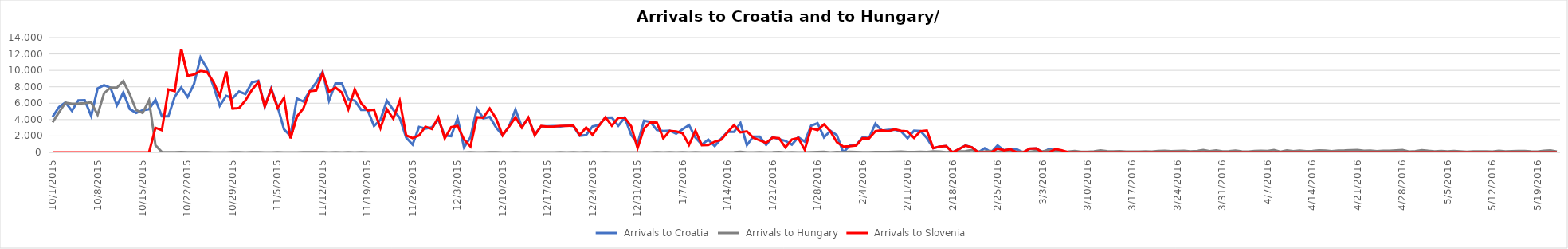
| Category | Arrivals to Croatia | Arrivals to Hungary | Arrivals to Slovenia |
|---|---|---|---|
| 10/1/15 | 4344 | 3667 | 0 |
| 10/2/15 | 5546 | 4897 | 0 |
| 10/3/15 | 6086 | 6056 | 0 |
| 10/4/15 | 5065 | 5925 | 0 |
| 10/5/15 | 6338 | 5952 | 0 |
| 10/6/15 | 6370 | 6000 | 0 |
| 10/7/15 | 4446 | 6103 | 0 |
| 10/8/15 | 7798 | 4583 | 6 |
| 10/9/15 | 8201 | 7215 | 0 |
| 10/10/15 | 7896 | 7907 | 0 |
| 10/11/15 | 5732 | 7897 | 0 |
| 10/12/15 | 7317 | 8702 | 0 |
| 10/13/15 | 5286 | 7081 | 0 |
| 10/14/15 | 4814 | 5157 | 0 |
| 10/15/15 | 5138 | 4808 | 0 |
| 10/16/15 | 5260 | 6353 | 0 |
| 10/17/15 | 6415 | 870 | 3000 |
| 10/18/15 | 4390 | 41 | 2700 |
| 10/19/15 | 4388 | 22 | 7677 |
| 10/20/15 | 6793 | 36 | 7478 |
| 10/21/15 | 7900 | 39 | 12616 |
| 10/22/15 | 6748 | 32 | 9339 |
| 10/23/15 | 8348 | 29 | 9500 |
| 10/24/15 | 11570 | 35 | 9925 |
| 10/25/15 | 10249 | 34 | 9818 |
| 10/26/15 | 8128 | 12 | 8625 |
| 10/27/15 | 5683 | 7 | 6877 |
| 10/28/15 | 6900 | 4 | 9848 |
| 10/29/15 | 6615 | 23 | 5341 |
| 10/30/15 | 7429 | 18 | 5409 |
| 10/31/15 | 7110 | 10 | 6344 |
| 11/1/15 | 8534 | 14 | 7611 |
| 11/2/15 | 8746 | 31 | 8568 |
| 11/3/15 | 5573 | 8 | 5591 |
| 11/4/15 | 7792 | 10 | 7693 |
| 11/5/15 | 5587 | 18 | 5426 |
| 11/6/15 | 2809 | 4 | 6655 |
| 11/7/15 | 2000 | 8 | 1716 |
| 11/8/15 | 6579 | 9 | 4381 |
| 11/9/15 | 6214 | 25 | 5341 |
| 11/10/15 | 7474 | 14 | 7457 |
| 11/11/15 | 8524 | 13 | 7554 |
| 11/12/15 | 9823 | 23 | 9681 |
| 11/13/15 | 6314 | 6 | 7397 |
| 11/14/15 | 8405 | 21 | 7905 |
| 11/15/15 | 8415 | 8 | 7300 |
| 11/16/15 | 6490 | 15 | 5261 |
| 11/17/15 | 6304 | 5 | 7704 |
| 11/18/15 | 5180 | 15 | 5998 |
| 11/19/15 | 5167 | 4 | 5119 |
| 11/20/15 | 3230 | 9 | 5211 |
| 11/21/15 | 3977 | 2 | 2952 |
| 11/22/15 | 6305 | 11 | 5260 |
| 11/23/15 | 5184 | 4 | 4102 |
| 11/24/15 | 4203 | 4 | 6297 |
| 11/25/15 | 1808 | 6 | 2070 |
| 11/26/15 | 952 | 10 | 1742 |
| 11/27/15 | 3095 | 2 | 2065 |
| 11/28/15 | 2886 | 6 | 3139 |
| 11/29/15 | 3060 | 3 | 2843 |
| 11/30/15 | 4009 | 7 | 4274 |
| 12/1/15 | 2066 | 4 | 1709 |
| 12/2/15 | 1982 | 4 | 3077 |
| 12/3/15 | 4174 | 9 | 3237 |
| 12/4/15 | 611 | 1 | 1577 |
| 12/5/15 | 1835 | 31 | 715 |
| 12/6/15 | 5339 | 7 | 4288 |
| 12/7/15 | 4162 | 0 | 4240 |
| 12/8/15 | 4335 | 13 | 5351 |
| 12/9/15 | 3027 | 14 | 4103 |
| 12/10/15 | 2076 | 3 | 2078 |
| 12/11/15 | 3149 | 0 | 3149 |
| 12/12/15 | 5225 | 13 | 4271 |
| 12/13/15 | 3112 | 10 | 3016 |
| 12/14/15 | 4174 | 3 | 4250 |
| 12/15/15 | 2160 | 2 | 2098 |
| 12/16/15 | 3177 | 6 | 3214 |
| 12/17/15 | 3192 | 0 | 3135 |
| 12/18/15 | 3200 | 11 | 3150 |
| 12/19/15 | 3156 | 31 | 3222 |
| 12/20/15 | 3276 | 8 | 3233 |
| 12/21/15 | 3210 | 25 | 3278 |
| 12/22/15 | 2027 | 1 | 2118 |
| 12/23/15 | 2116 | 21 | 3030 |
| 12/24/15 | 3166 | 8 | 2131 |
| 12/25/15 | 3339 | 2 | 3257 |
| 12/26/15 | 4241 | 17 | 4274 |
| 12/27/15 | 4251 | 10 | 3253 |
| 12/28/15 | 3249 | 0 | 4228 |
| 12/29/15 | 4253 | 0 | 4239 |
| 12/30/15 | 2132 | 11 | 3195 |
| 12/31/15 | 1058 | 5 | 511 |
| 1/1/16 | 3869 | 0 | 2914 |
| 1/2/16 | 3710 | 0 | 3690 |
| 1/3/16 | 2732 | 17 | 3619 |
| 1/4/16 | 2591 | 3 | 1708 |
| 1/5/16 | 2650 | 18 | 2626 |
| 1/6/16 | 2273 | 5 | 2550 |
| 1/7/16 | 2814 | 31 | 2337 |
| 1/8/16 | 3332 | 7 | 916 |
| 1/9/16 | 1799 | 15 | 2630 |
| 1/10/16 | 942 | 6 | 880 |
| 1/11/16 | 1549 | 7 | 897 |
| 1/12/16 | 769 | 2 | 1308 |
| 1/13/16 | 1679 | 5 | 1544 |
| 1/14/16 | 2502 | 4 | 2449 |
| 1/15/16 | 2493 | 14 | 3330 |
| 1/16/16 | 3579 | 65 | 2435 |
| 1/17/16 | 878 | 11 | 2570 |
| 1/18/16 | 1930 | 9 | 1783 |
| 1/19/16 | 1917 | 29 | 1476 |
| 1/20/16 | 914 | 10 | 1154 |
| 1/21/16 | 1865 | 13 | 1787 |
| 1/22/16 | 1599 | 47 | 1738 |
| 1/23/16 | 1394 | 10 | 606 |
| 1/24/16 | 946 | 15 | 1564 |
| 1/25/16 | 1847 | 5 | 1746 |
| 1/26/16 | 1309 | 4 | 326 |
| 1/27/16 | 3256 | 36 | 2935 |
| 1/28/16 | 3565 | 51 | 2719 |
| 1/29/16 | 1843 | 69 | 3416 |
| 1/30/16 | 2641 | 6 | 2556 |
| 1/31/16 | 2098 | 39 | 1249 |
| 2/1/16 | 0 | 31 | 716 |
| 2/2/16 | 822 | 69 | 765 |
| 2/3/16 | 881 | 46 | 841 |
| 2/4/16 | 1836 | 31 | 1733 |
| 2/5/16 | 1750 | 19 | 1713 |
| 2/6/16 | 3510 | 49 | 2580 |
| 2/7/16 | 2658 | 53 | 2694 |
| 2/8/16 | 2736 | 48 | 2582 |
| 2/9/16 | 2764 | 72 | 2805 |
| 2/10/16 | 2544 | 104 | 2637 |
| 2/11/16 | 1716 | 54 | 2547 |
| 2/12/16 | 2635 | 39 | 1774 |
| 2/13/16 | 2595 | 66 | 2576 |
| 2/14/16 | 1749 | 51 | 2660 |
| 2/15/16 | 512 | 119 | 516 |
| 2/16/16 | 701 | 93 | 715 |
| 2/17/16 | 769 | 34 | 769 |
| 2/18/16 | 0 | 73 | 0 |
| 2/19/16 | 408 | 113 | 407 |
| 2/20/16 | 834 | 151 | 828 |
| 2/21/16 | 630 | 288 | 623 |
| 2/22/16 | 0 | 103 | 0 |
| 2/23/16 | 507 | 112 | 0 |
| 2/24/16 | 0 | 166 | 0 |
| 2/25/16 | 841 | 76 | 478 |
| 2/26/16 | 250 | 140 | 254 |
| 2/27/16 | 385 | 111 | 382 |
| 2/28/16 | 358 | 62 | 0 |
| 2/29/16 | 0 | 78 | 0 |
| 3/1/16 | 436 | 83 | 466 |
| 3/2/16 | 476 | 181 | 479 |
| 3/3/16 | 0 | 133 | 0 |
| 3/4/16 | 410 | 268 | 0 |
| 3/5/16 | 253 | 89 | 409 |
| 3/6/16 | 0 | 72 | 253 |
| 3/7/16 | 0 | 100 | 0 |
| 3/8/16 | 0 | 167 | 0 |
| 3/9/16 | 0 | 73 | 0 |
| 3/10/16 | 0 | 70 | 0 |
| 3/11/16 | 0 | 133 | 0 |
| 3/12/16 | 0 | 245 | 0 |
| 3/13/16 | 0 | 148 | 0 |
| 3/14/16 | 0 | 123 | 0 |
| 3/15/16 | 0 | 153 | 0 |
| 3/16/16 | 0 | 104 | 0 |
| 3/17/16 | 0 | 102 | 0 |
| 3/18/16 | 0 | 95 | 0 |
| 3/19/16 | 0 | 132 | 0 |
| 3/20/16 | 0 | 107 | 0 |
| 3/21/16 | 0 | 176 | 0 |
| 3/22/16 | 0 | 188 | 0 |
| 3/23/16 | 0 | 137 | 0 |
| 3/24/16 | 0 | 171 | 0 |
| 3/25/16 | 0 | 199 | 0 |
| 3/26/16 | 0 | 125 | 0 |
| 3/27/16 | 0 | 171 | 6 |
| 3/28/16 | 0 | 293 | 0 |
| 3/29/16 | 0 | 154 | 5 |
| 3/30/16 | 0 | 234 | 4 |
| 3/31/16 | 0 | 127 | 0 |
| 4/1/16 | 0 | 142 | 0 |
| 4/2/16 | 0 | 217 | 0 |
| 4/3/16 | 0 | 119 | 0 |
| 4/4/16 | 0 | 99 | 0 |
| 4/5/16 | 0 | 176 | 2 |
| 4/6/16 | 0 | 191 | 0 |
| 4/7/16 | 0 | 178 | 0 |
| 4/8/16 | 0 | 280 | 0 |
| 4/9/16 | 0 | 83 | 0 |
| 4/10/16 | 0 | 230 | 0 |
| 4/11/16 | 0 | 149 | 0 |
| 4/12/16 | 0 | 214 | 0 |
| 4/13/16 | 0 | 150 | 0 |
| 4/14/16 | 0 | 161 | 0 |
| 4/15/16 | 0 | 237 | 0 |
| 4/16/16 | 0 | 210 | 0 |
| 4/17/16 | 0 | 144 | 0 |
| 4/18/16 | 0 | 229 | 0 |
| 4/19/16 | 0 | 235 | 0 |
| 4/20/16 | 0 | 274 | 0 |
| 4/21/16 | 0 | 294 | 0 |
| 4/22/16 | 0 | 195 | 0 |
| 4/23/16 | 0 | 226 | 0 |
| 4/24/16 | 0 | 151 | 0 |
| 4/25/16 | 0 | 202 | 0 |
| 4/26/16 | 0 | 190 | 0 |
| 4/27/16 | 0 | 241 | 0 |
| 4/28/16 | 0 | 284 | 0 |
| 4/29/16 | 0 | 108 | 0 |
| 4/30/16 | 0 | 141 | 0 |
| 5/1/16 | 0 | 274 | 0 |
| 5/2/16 | 0 | 187 | 0 |
| 5/3/16 | 0 | 131 | 0 |
| 5/4/16 | 0 | 169 | 0 |
| 5/5/16 | 0 | 133 | 0 |
| 5/6/16 | 0 | 178 | 0 |
| 5/7/16 | 0 | 132 | 0 |
| 5/8/16 | 0 | 75 | 0 |
| 5/9/16 | 0 | 124 | 0 |
| 5/10/16 | 0 | 128 | 0 |
| 5/11/16 | 0 | 120 | 0 |
| 5/12/16 | 0 | 89 | 0 |
| 5/13/16 | 0 | 201 | 0 |
| 5/14/16 | 0 | 120 | 0 |
| 5/15/16 | 0 | 139 | 0 |
| 5/16/16 | 0 | 169 | 0 |
| 5/17/16 | 0 | 164 | 0 |
| 5/18/16 | 0 | 121 | 0 |
| 5/19/16 | 0 | 100 | 0 |
| 5/20/16 | 0 | 198 | 0 |
| 5/21/16 | 0 | 245 | 0 |
| 5/22/16 | 0 | 108 | 0 |